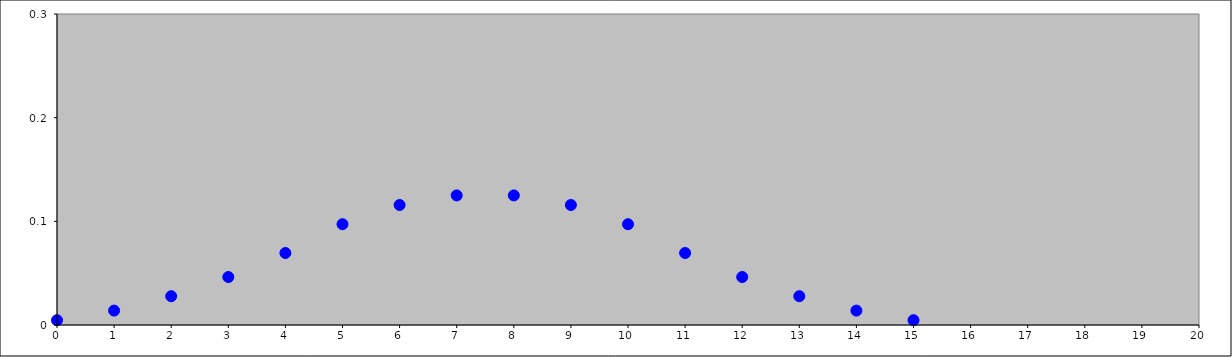
| Category | Series 0 |
|---|---|
| 0.0 | 0.005 |
| 1.0 | 0.014 |
| 2.0 | 0.028 |
| 3.0 | 0.046 |
| 4.0 | 0.069 |
| 5.0 | 0.097 |
| 6.0 | 0.116 |
| 7.0 | 0.125 |
| 8.0 | 0.125 |
| 9.0 | 0.116 |
| 10.0 | 0.097 |
| 11.0 | 0.069 |
| 12.0 | 0.046 |
| 13.0 | 0.028 |
| 14.0 | 0.014 |
| 15.0 | 0.005 |